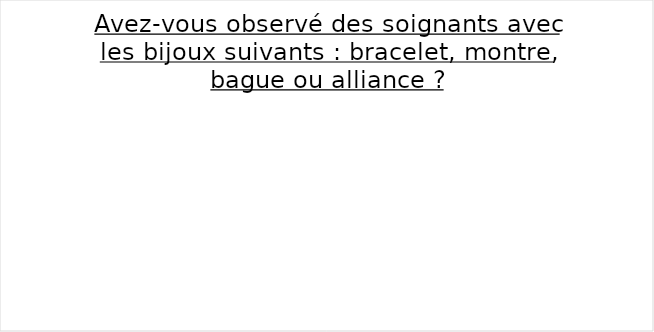
| Category | Series 0 |
|---|---|
| Oui | 0 |
| Non | 0 |
| Je n'ai pas fait attention | 0 |